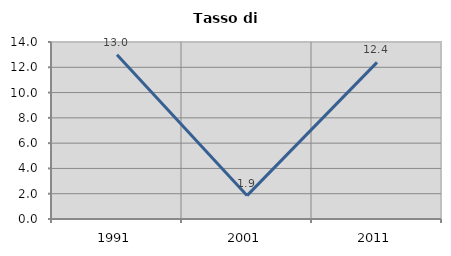
| Category | Tasso di disoccupazione   |
|---|---|
| 1991.0 | 13 |
| 2001.0 | 1.852 |
| 2011.0 | 12.389 |